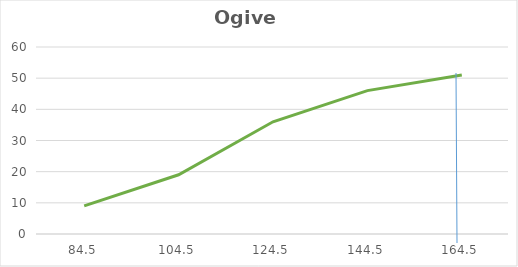
| Category | Series 0 |
|---|---|
| 84.5 | 9 |
| 104.5 | 19 |
| 124.5 | 36 |
| 144.5 | 46 |
| 164.5 | 51 |